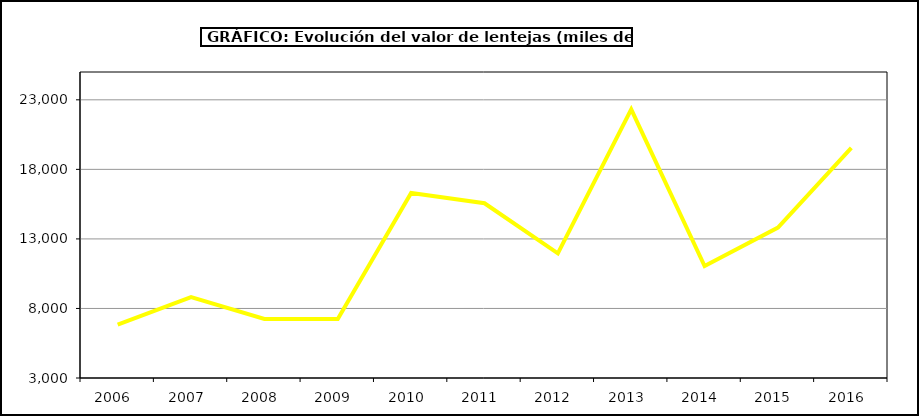
| Category | Valor |
|---|---|
| 2006.0 | 6843.6 |
| 2007.0 | 8820.816 |
| 2008.0 | 7246.764 |
| 2009.0 | 7234.01 |
| 2010.0 | 16307.099 |
| 2011.0 | 15562.569 |
| 2012.0 | 11960.065 |
| 2013.0 | 22313.5 |
| 2014.0 | 11051.282 |
| 2015.0 | 13811 |
| 2016.0 | 19549 |